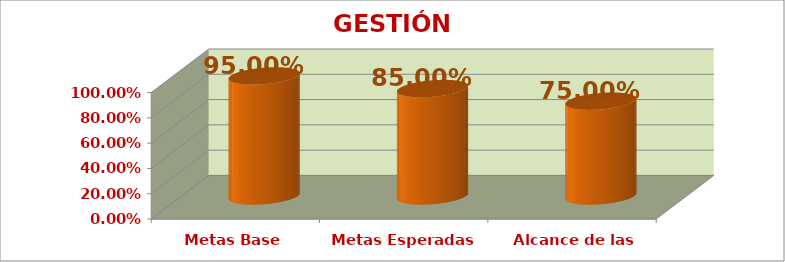
| Category | GESTIÓN ESTRATÉGICA |
|---|---|
| Metas Base | 0.95 |
| Metas Esperadas | 0.85 |
| Alcance de las Metas | 0.75 |